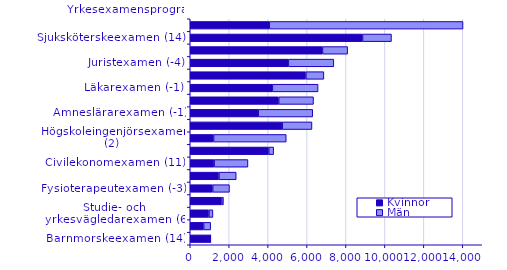
| Category | Kvinnor | Män |
|---|---|---|
| Barnmorskeexamen (14) | 1045 | 3 |
| Tandläkarexamen (6) | 687 | 363 |
| Studie- och yrkesvägledarexamen (6) | 958 | 207 |
| Specialpedagogexamen (2) | 1612 | 93 |
| Fysioterapeutexamen (-3) | 1152 | 863 |
| Arkitektexamen (6) | 1473 | 889 |
| Civilekonomexamen (11) | 1226 | 1739 |
| Förskollärarexamen (2) | 4032 | 253 |
| Högskoleingenjörsexamen (2) | 1200 | 3732 |
| Grundlärarexamen (4) | 4724 | 1529 |
| Ämneslärarexamen (-1) | 3492 | 2800 |
| Psykologexamen (-6) | 4543 | 1790 |
| Läkarexamen (-1) | 4218 | 2349 |
| Specialistsjuksköterskeexamen (2) | 5938 | 927 |
| Juristexamen (-4) | 5041 | 2335 |
| Socionomexamen (10) | 6791 | 1295 |
| Sjuksköterskeexamen (14) | 8850 | 1487 |
| Civilingenjörsexamen (0) | 4061 | 9951 |